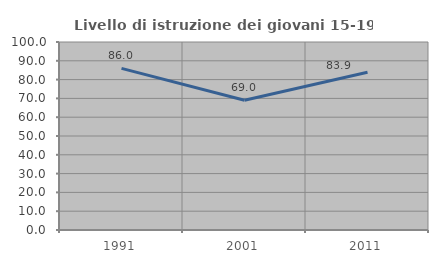
| Category | Livello di istruzione dei giovani 15-19 anni |
|---|---|
| 1991.0 | 85.965 |
| 2001.0 | 69.048 |
| 2011.0 | 83.871 |